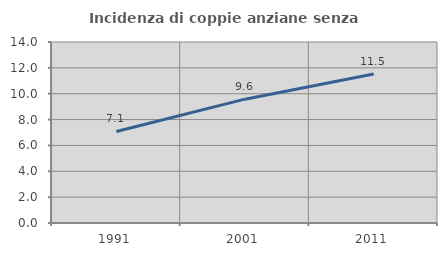
| Category | Incidenza di coppie anziane senza figli  |
|---|---|
| 1991.0 | 7.08 |
| 2001.0 | 9.579 |
| 2011.0 | 11.525 |